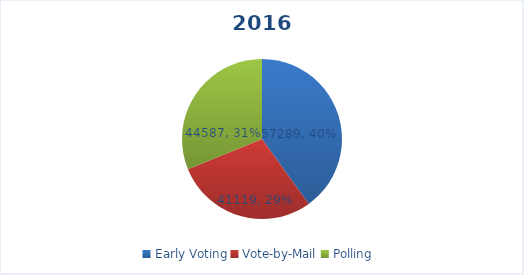
| Category | Series 0 |
|---|---|
| Early Voting | 57289 |
| Vote-by-Mail | 41119 |
| Polling | 44587 |